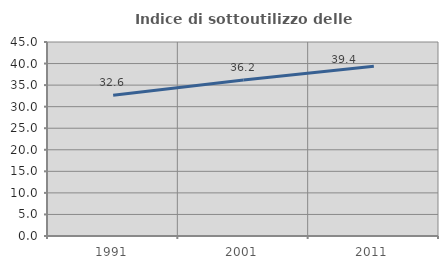
| Category | Indice di sottoutilizzo delle abitazioni  |
|---|---|
| 1991.0 | 32.642 |
| 2001.0 | 36.17 |
| 2011.0 | 39.357 |